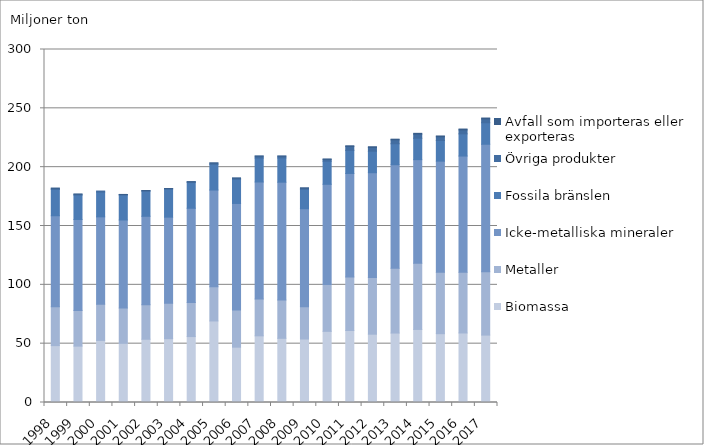
| Category | Biomassa | Metaller | Icke-metalliska mineraler | Fossila bränslen | Övriga produkter | Avfall som importeras eller exporteras |
|---|---|---|---|---|---|---|
| 1998.0 | 48.352 | 33.124 | 77.234 | 22.307 | 1.083 | 0 |
| 1999.0 | 47.914 | 30.373 | 77.263 | 20.74 | 0.784 | 0 |
| 2000.0 | 52.793 | 30.749 | 74.22 | 21.066 | 0.882 | 0 |
| 2001.0 | 50.279 | 29.982 | 74.843 | 21.147 | 0.553 | 0 |
| 2002.0 | 53.752 | 29.421 | 75.081 | 21.298 | 0.531 | 0.002 |
| 2003.0 | 54.246 | 30.173 | 73.097 | 23.796 | 0.472 | 0.002 |
| 2004.0 | 56.031 | 28.995 | 80.051 | 21.838 | 0.702 | 0.002 |
| 2005.0 | 69.298 | 29.115 | 82.129 | 21.876 | 1.108 | 0.017 |
| 2006.0 | 47.033 | 31.629 | 90.495 | 20.558 | 1.006 | 0.008 |
| 2007.0 | 56.66 | 31.276 | 99.466 | 20.378 | 1.629 | 0.013 |
| 2008.0 | 54.553 | 32.553 | 100.126 | 20.614 | 1.537 | 0.027 |
| 2009.0 | 53.97 | 27.403 | 83.328 | 16.476 | 1.024 | 0.156 |
| 2010.0 | 60.472 | 39.747 | 85.219 | 19.63 | 1.573 | 0.29 |
| 2011.0 | 61.164 | 45.578 | 87.908 | 19.643 | 3.384 | 0.46 |
| 2012.0 | 58.054 | 48.252 | 88.97 | 18.269 | 3.263 | 0.534 |
| 2013.0 | 59.028 | 55.01 | 88.057 | 17.798 | 3.334 | 0.56 |
| 2014.0 | 62.101 | 56.273 | 88.018 | 18.189 | 3.507 | 0.667 |
| 2015.0 | 58.48 | 52.13 | 94.499 | 17.548 | 3.187 | 0.671 |
| 2016.0 | 59.093 | 51.509 | 98.845 | 18.861 | 3.379 | 0.712 |
| 2017.0 | 57.287 | 53.889 | 108.29 | 18.27 | 3.265 | 0.756 |